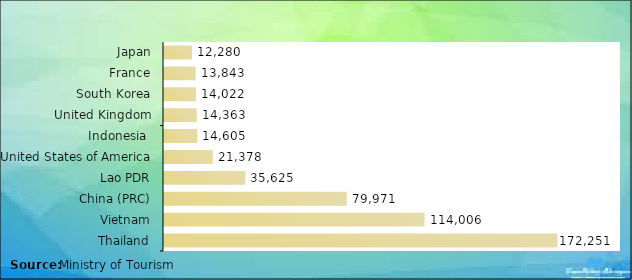
| Category | Series 0 |
|---|---|
| Thailand | 172251 |
| Vietnam | 114006 |
| China (PRC) | 79971 |
| Lao PDR | 35625 |
| United States of America | 21378 |
| Indonesia  | 14605 |
| United Kingdom | 14363 |
| South Korea | 14022 |
| France | 13843 |
| Japan | 12280 |